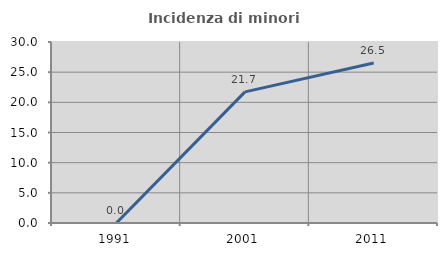
| Category | Incidenza di minori stranieri |
|---|---|
| 1991.0 | 0 |
| 2001.0 | 21.739 |
| 2011.0 | 26.531 |